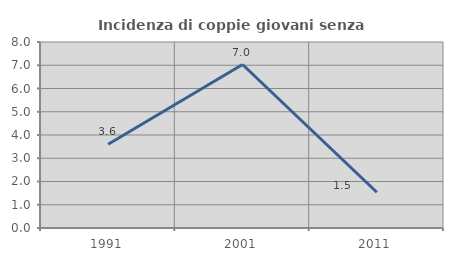
| Category | Incidenza di coppie giovani senza figli |
|---|---|
| 1991.0 | 3.604 |
| 2001.0 | 7.031 |
| 2011.0 | 1.538 |